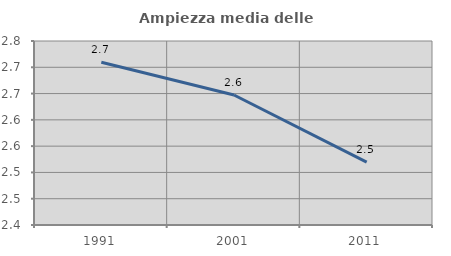
| Category | Ampiezza media delle famiglie |
|---|---|
| 1991.0 | 2.71 |
| 2001.0 | 2.647 |
| 2011.0 | 2.519 |